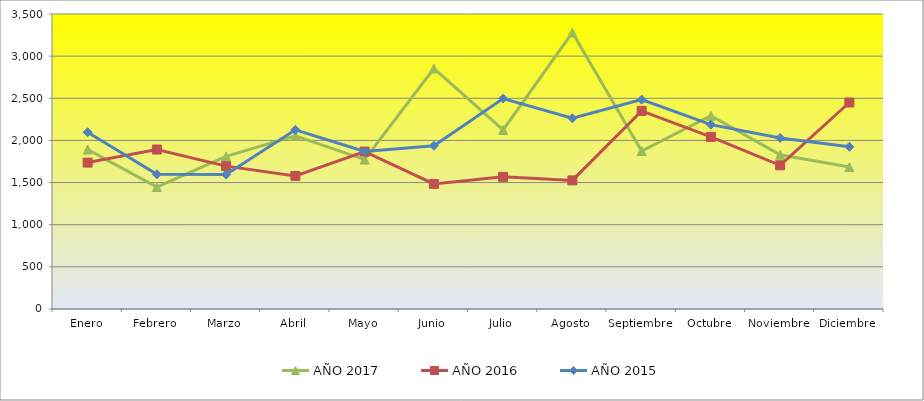
| Category | AÑO 2017 | AÑO 2016 | AÑO 2015 |
|---|---|---|---|
| Enero | 1892.105 | 1737 | 2097 |
| Febrero | 1447.368 | 1892 | 1598 |
| Marzo | 1810.526 | 1695 | 1595 |
| Abril | 2055.263 | 1579 | 2126 |
| Mayo | 1772.727 | 1868 | 1868 |
| Junio | 2853.409 | 1484 | 1937 |
| Julio | 2123.864 | 1568 | 2497 |
| Agosto | 3279.545 | 1526 | 2263 |
| Septiembre | 1875 | 2350 | 2484 |
| Octubre | 2293.333 | 2042 | 2187 |
| Noviembre | 1830 | 1705 | 2029 |
| Diciembre | 1684.091 | 2450 | 1924 |